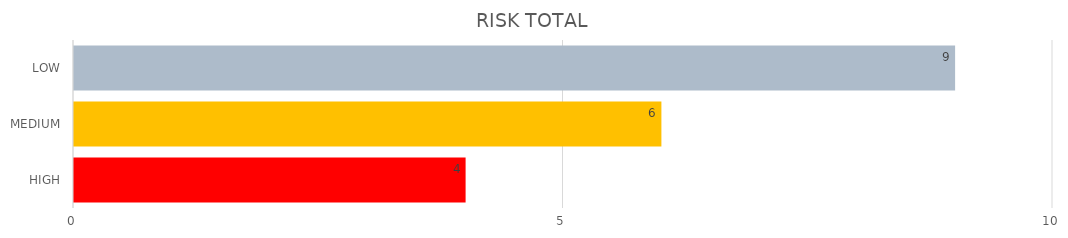
| Category | Series 1 | Series 0 |
|---|---|---|
| HIGH | 4 | 4 |
| MEDIUM | 6 | 6 |
| LOW | 9 | 9 |